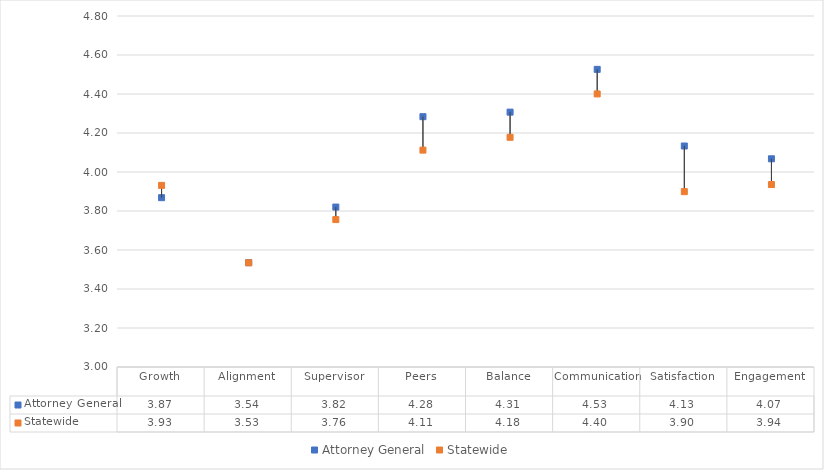
| Category | Attorney General | Statewide |
|---|---|---|
| Growth | 3.868 | 3.931 |
| Alignment | 3.535 | 3.534 |
| Supervisor | 3.82 | 3.756 |
| Peers | 4.284 | 4.112 |
| Balance | 4.307 | 4.178 |
| Communication | 4.526 | 4.4 |
| Satisfaction | 4.133 | 3.899 |
| Engagement | 4.068 | 3.936 |